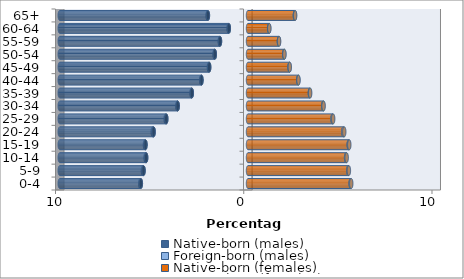
| Category | Native-born (males) | Foreign-born (males) | Native-born (females) | Foreign-born (females) |
|---|---|---|---|---|
| 0-4 | -5.692 | -0.036 | 5.453 | 0.032 |
| 5-9 | -5.548 | -0.037 | 5.325 | 0.035 |
| 10-14 | -5.41 | -0.034 | 5.21 | 0.033 |
| 15-19 | -5.446 | -0.03 | 5.351 | 0.031 |
| 20-24 | -5.013 | -0.051 | 5.062 | 0.052 |
| 25-29 | -4.341 | -0.035 | 4.49 | 0.036 |
| 30-34 | -3.734 | -0.021 | 3.994 | 0.021 |
| 35-39 | -2.983 | -0.018 | 3.286 | 0.017 |
| 40-44 | -2.472 | -0.017 | 2.667 | 0.015 |
| 45-49 | -2.062 | -0.016 | 2.204 | 0.013 |
| 50-54 | -1.763 | -0.015 | 1.923 | 0.012 |
| 55-59 | -1.488 | -0.014 | 1.641 | 0.011 |
| 60-64 | -1.019 | -0.011 | 1.122 | 0.009 |
| 65+ | -2.129 | -0.018 | 2.49 | 0.015 |